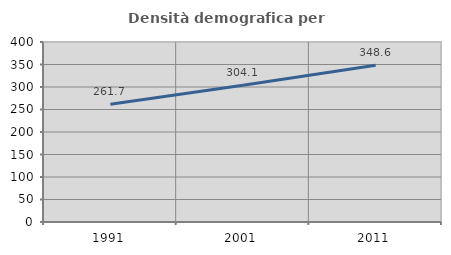
| Category | Densità demografica |
|---|---|
| 1991.0 | 261.685 |
| 2001.0 | 304.128 |
| 2011.0 | 348.56 |